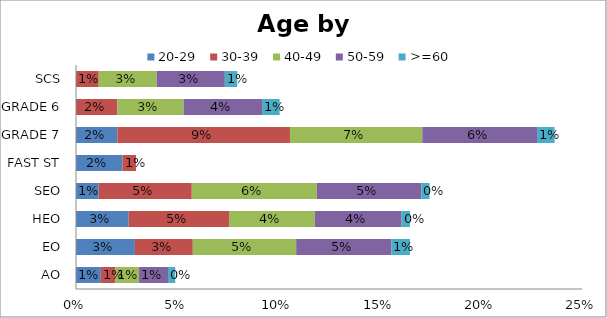
| Category | 20-29 | 30-39 | 40-49 | 50-59 | >=60 |
|---|---|---|---|---|---|
| AO | 0.012 | 0.007 | 0.012 | 0.014 | 0.004 |
| EO | 0.029 | 0.029 | 0.051 | 0.047 | 0.009 |
| HEO | 0.026 | 0.05 | 0.042 | 0.043 | 0.004 |
| SEO | 0.011 | 0.046 | 0.062 | 0.052 | 0.004 |
| FAST ST | 0.023 | 0.007 | 0 | 0 | 0 |
| GRADE 7 | 0.02 | 0.085 | 0.065 | 0.057 | 0.009 |
| GRADE 6 | 0 | 0.02 | 0.033 | 0.039 | 0.009 |
| SCS | 0 | 0.011 | 0.029 | 0.034 | 0.006 |